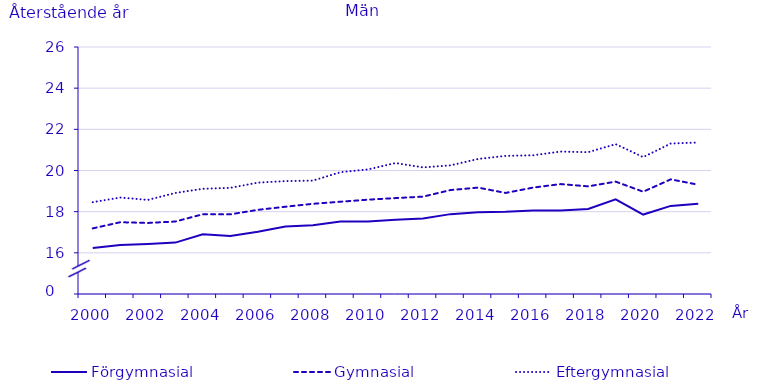
| Category | Förgymnasial | Gymnasial | Eftergymnasial |
|---|---|---|---|
| 2000.0 | 16.235 | 17.187 | 18.462 |
| 2001.0 | 16.382 | 17.487 | 18.686 |
| 2002.0 | 16.431 | 17.452 | 18.571 |
| 2003.0 | 16.497 | 17.521 | 18.91 |
| 2004.0 | 16.902 | 17.875 | 19.111 |
| 2005.0 | 16.817 | 17.87 | 19.157 |
| 2006.0 | 17.022 | 18.089 | 19.41 |
| 2007.0 | 17.28 | 18.24 | 19.485 |
| 2008.0 | 17.342 | 18.382 | 19.509 |
| 2009.0 | 17.518 | 18.483 | 19.918 |
| 2010.0 | 17.52 | 18.583 | 20.052 |
| 2011.0 | 17.607 | 18.659 | 20.362 |
| 2012.0 | 17.67 | 18.73 | 20.15 |
| 2013.0 | 17.88 | 19.05 | 20.25 |
| 2014.0 | 17.97 | 19.17 | 20.56 |
| 2015.0 | 18 | 18.91 | 20.71 |
| 2016.0 | 18.06 | 19.17 | 20.74 |
| 2017.0 | 18.06 | 19.34 | 20.92 |
| 2018.0 | 18.13 | 19.23 | 20.89 |
| 2019.0 | 18.6 | 19.46 | 21.28 |
| 2020.0 | 17.86 | 18.97 | 20.65 |
| 2021.0 | 18.28 | 19.57 | 21.31 |
| 2022.0 | 18.38 | 19.31 | 21.36 |